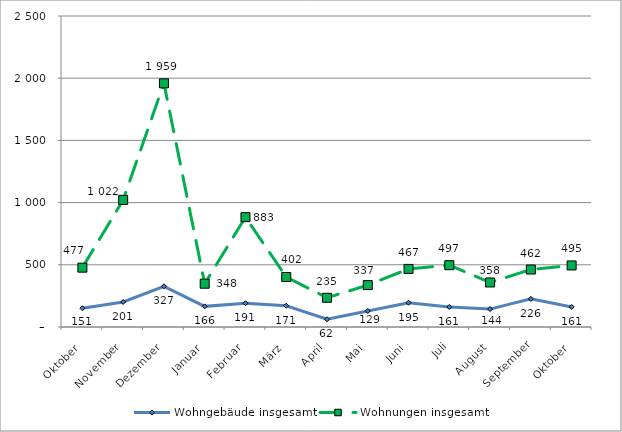
| Category | Wohngebäude insgesamt | Wohnungen insgesamt |
|---|---|---|
| Oktober | 151 | 477 |
| November | 201 | 1022 |
| Dezember | 327 | 1959 |
| Januar | 166 | 348 |
| Februar | 191 | 883 |
| März | 171 | 402 |
| April | 62 | 235 |
| Mai | 129 | 337 |
| Juni | 195 | 467 |
| Juli | 161 | 497 |
| August | 144 | 358 |
| September | 226 | 462 |
| Oktober | 161 | 495 |